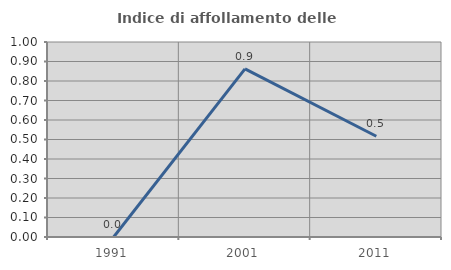
| Category | Indice di affollamento delle abitazioni  |
|---|---|
| 1991.0 | 0 |
| 2001.0 | 0.862 |
| 2011.0 | 0.517 |